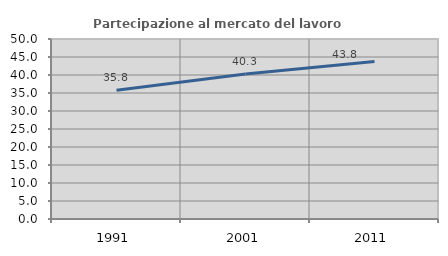
| Category | Partecipazione al mercato del lavoro  femminile |
|---|---|
| 1991.0 | 35.767 |
| 2001.0 | 40.265 |
| 2011.0 | 43.769 |